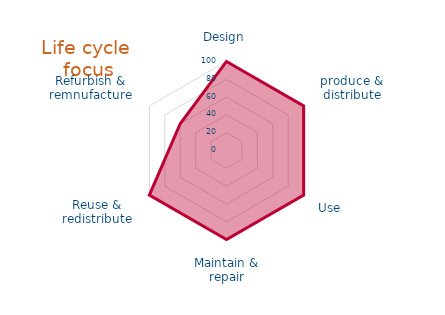
| Category | Fit your product/ service  |
|---|---|
| 0 | 100 |
| 1 | 100 |
| 2 | 100 |
| 3 | 100 |
| 4 | 100 |
| 5 | 60 |